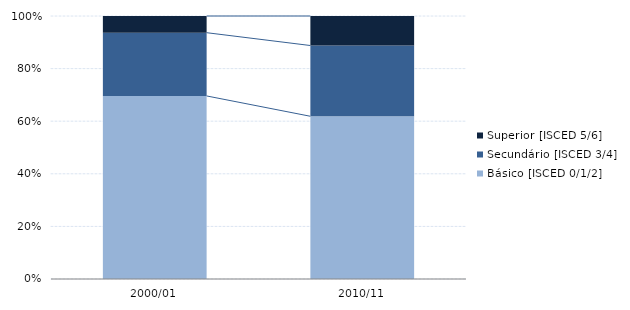
| Category | Básico [ISCED 0/1/2] | Secundário [ISCED 3/4] | Superior [ISCED 5/6] |
|---|---|---|---|
| 2000/01 | 0.7 | 0.242 | 0.064 |
| 2010/11 | 0.619 | 0.269 | 0.112 |